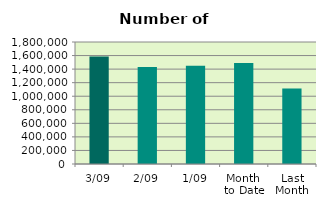
| Category | Series 0 |
|---|---|
| 3/09 | 1587182 |
| 2/09 | 1432594 |
| 1/09 | 1447772 |
| Month 
to Date | 1489182.667 |
| Last
Month | 1113186.286 |